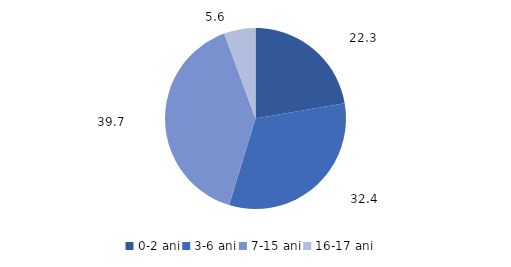
| Category | Series 0 |
|---|---|
| 0-2 ani | 22.299 |
| 3-6 ani | 32.407 |
| 7-15 ani | 39.672 |
| 16-17 ani | 5.622 |